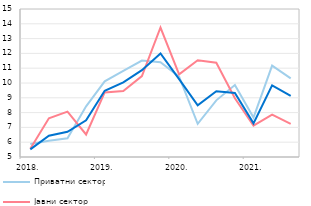
| Category | Приватни сектор | Јавни сектор | Укупна зарада |
|---|---|---|---|
| 2018. | 5.872 | 5.562 | 5.513 |
| II | 6.102 | 7.617 | 6.439 |
| III | 6.267 | 8.063 | 6.703 |
| IV | 8.427 | 6.522 | 7.476 |
| 2019. | 10.114 | 9.362 | 9.473 |
| II | 10.825 | 9.459 | 10.044 |
| III | 11.513 | 10.466 | 10.865 |
| IV | 11.406 | 13.749 | 12 |
| 2020. | 10.428 | 10.588 | 10.257 |
| II | 7.243 | 11.542 | 8.497 |
| III | 8.828 | 11.371 | 9.447 |
| IV | 9.866 | 8.967 | 9.324 |
| 2021. | 7.664 | 7.113 | 7.271 |
| II | 11.171 | 7.863 | 9.844 |
| III* | 10.317 | 7.236 | 9.134 |